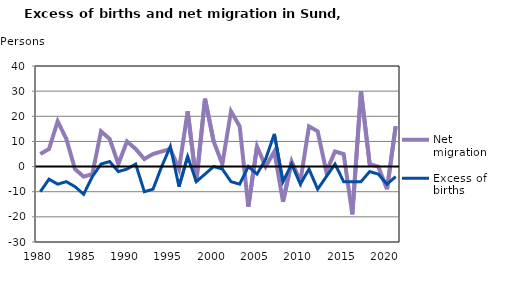
| Category | Net migration | Excess of births |
|---|---|---|
| 1980.0 | 5 | -10 |
| 1981.0 | 7 | -5 |
| 1982.0 | 18 | -7 |
| 1983.0 | 11 | -6 |
| 1984.0 | -1 | -8 |
| 1985.0 | -4 | -11 |
| 1986.0 | -3 | -4 |
| 1987.0 | 14 | 1 |
| 1988.0 | 11 | 2 |
| 1989.0 | 1 | -2 |
| 1990.0 | 10 | -1 |
| 1991.0 | 7 | 1 |
| 1992.0 | 3 | -10 |
| 1993.0 | 5 | -9 |
| 1994.0 | 6 | 0 |
| 1995.0 | 7 | 8 |
| 1996.0 | -1 | -8 |
| 1997.0 | 22 | 4 |
| 1998.0 | -6 | -6 |
| 1999.0 | 27 | -3 |
| 2000.0 | 10 | 0 |
| 2001.0 | 1 | -1 |
| 2002.0 | 22 | -6 |
| 2003.0 | 16 | -7 |
| 2004.0 | -16 | 0 |
| 2005.0 | 8 | -3 |
| 2006.0 | 0 | 3 |
| 2007.0 | 6 | 13 |
| 2008.0 | -14 | -6 |
| 2009.0 | 2 | 1 |
| 2010.0 | -6 | -7 |
| 2011.0 | 16 | -1 |
| 2012.0 | 14 | -9 |
| 2013.0 | -2 | -4 |
| 2014.0 | 6 | 1 |
| 2015.0 | 5 | -6 |
| 2016.0 | -19 | -6 |
| 2017.0 | 30 | -6 |
| 2018.0 | 1 | -2 |
| 2019.0 | 0 | -3 |
| 2020.0 | -9 | -7 |
| 2021.0 | 16 | -4 |